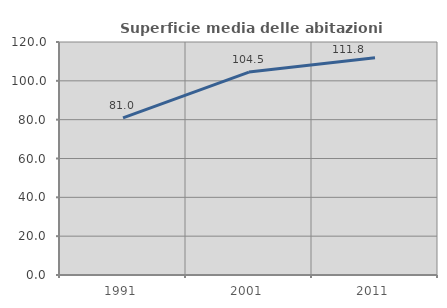
| Category | Superficie media delle abitazioni occupate |
|---|---|
| 1991.0 | 80.96 |
| 2001.0 | 104.495 |
| 2011.0 | 111.835 |